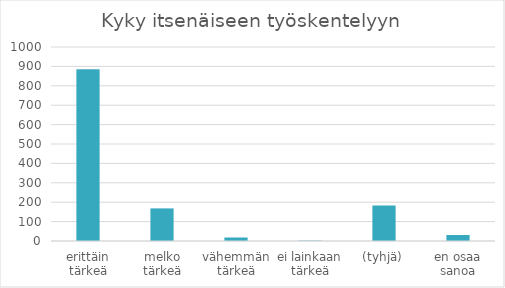
| Category | Summa |
|---|---|
| erittäin tärkeä | 885 |
| melko tärkeä | 168 |
| vähemmän tärkeä | 18 |
| ei lainkaan tärkeä | 2 |
| (tyhjä) | 183 |
| en osaa sanoa | 31 |